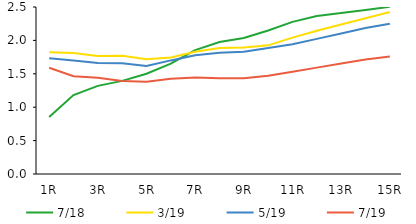
| Category | 7/18 | 3/19 | 5/19 | 7/19 |
|---|---|---|---|---|
|  1R | 0.853 | 1.821 | 1.731 | 1.591 |
|  2R | 1.182 | 1.811 | 1.697 | 1.464 |
|  3R | 1.319 | 1.766 | 1.662 | 1.441 |
|  4R | 1.394 | 1.771 | 1.658 | 1.391 |
|  5R | 1.5 | 1.718 | 1.616 | 1.38 |
|  6R | 1.651 | 1.744 | 1.701 | 1.425 |
|  7R | 1.855 | 1.829 | 1.777 | 1.444 |
|  8R | 1.975 | 1.886 | 1.814 | 1.435 |
|  9R | 2.036 | 1.895 | 1.829 | 1.432 |
|  10R | 2.149 | 1.926 | 1.886 | 1.472 |
|  11R | 2.277 | 2.041 | 1.942 | 1.531 |
|  12R | 2.364 | 2.145 | 2.023 | 1.592 |
|  13R | 2.41 | 2.238 | 2.104 | 1.653 |
|  14R | 2.456 | 2.331 | 2.185 | 1.714 |
|  15R | 2.502 | 2.425 | 2.25 | 1.758 |